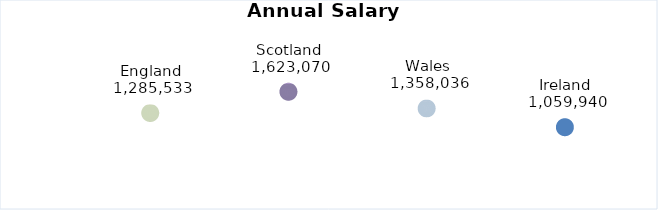
| Category | Series 0 |
|---|---|
| 0 | 1285533.167 |
| 1 | 1623069.5 |
| 2 | 1358036.333 |
| 3 | 1059939.833 |